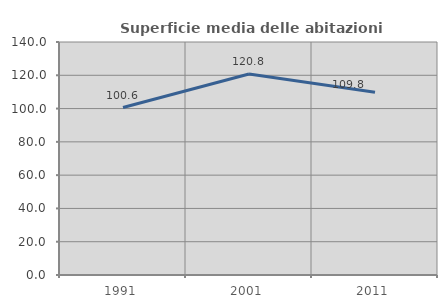
| Category | Superficie media delle abitazioni occupate |
|---|---|
| 1991.0 | 100.61 |
| 2001.0 | 120.815 |
| 2011.0 | 109.788 |